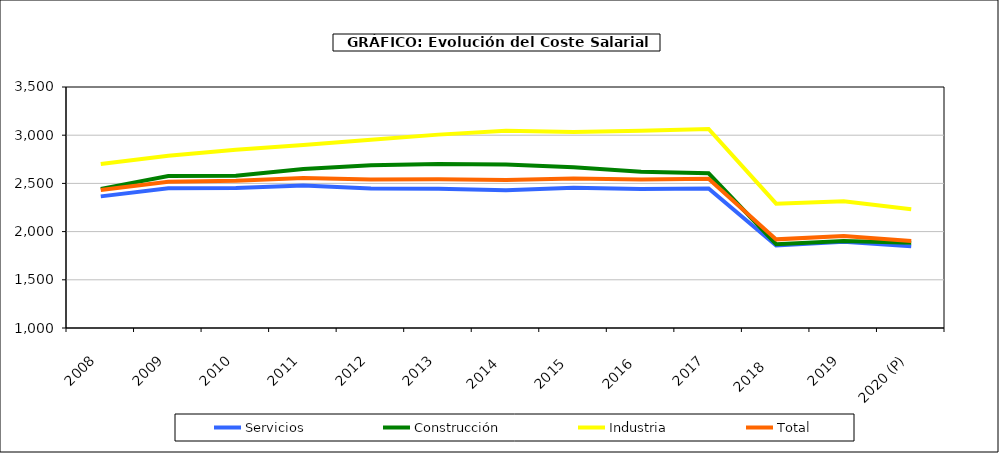
| Category | Servicios | Construcción | Industria | Total |
|---|---|---|---|---|
|  2008 | 2365.308 | 2443.128 | 2702.292 | 2431.918 |
|  2009 | 2448.698 | 2575.892 | 2785.975 | 2516.818 |
|  2010 | 2452.875 | 2578.725 | 2848.912 | 2526.97 |
|  2011 | 2477.602 | 2649.94 | 2897.9 | 2556.79 |
|  2012 | 2446.112 | 2688.855 | 2953.138 | 2540.255 |
|  2013 | 2443.342 | 2702.31 | 3005.935 | 2544.135 |
|  2014  | 2428.98 | 2696.288 | 3044.88 | 2535.985 |
|  2015  | 2453.618 | 2667.11 | 3033.778 | 2551.698 |
|  2016  | 2442.583 | 2621.615 | 3044.992 | 2541.34 |
|  2017 | 2448.048 | 2604.682 | 3065.288 | 2547.36 |
|  2018   | 1855.958 | 1869.548 | 2289.278 | 1919.42 |
|  2019 | 1894.81 | 1901.285 | 2315.172 | 1955.188 |
|  2020 (P) | 1846.728 | 1885.358 | 2231.732 | 1903.575 |